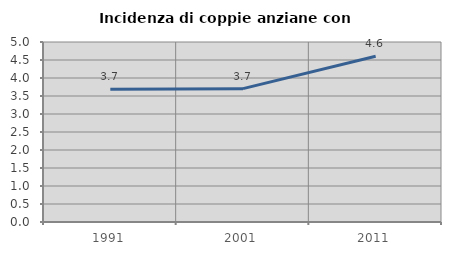
| Category | Incidenza di coppie anziane con figli |
|---|---|
| 1991.0 | 3.686 |
| 2001.0 | 3.704 |
| 2011.0 | 4.606 |